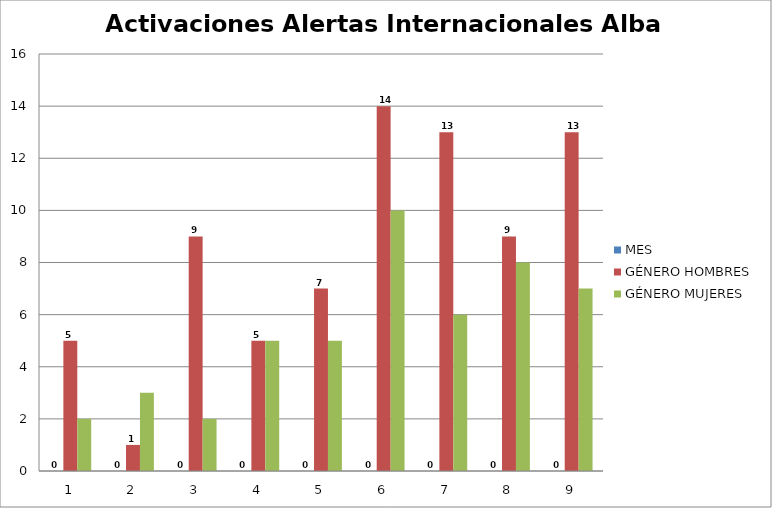
| Category | MES | GÉNERO HOMBRES | GÉNERO MUJERES |
|---|---|---|---|
| 0 | 0 | 5 | 2 |
| 1 | 0 | 1 | 3 |
| 2 | 0 | 9 | 2 |
| 3 | 0 | 5 | 5 |
| 4 | 0 | 7 | 5 |
| 5 | 0 | 14 | 10 |
| 6 | 0 | 13 | 6 |
| 7 | 0 | 9 | 8 |
| 8 | 0 | 13 | 7 |